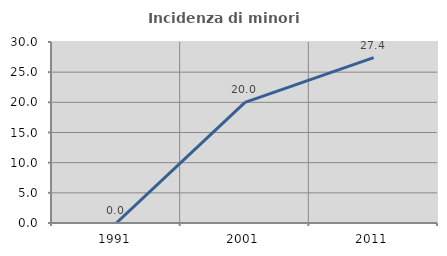
| Category | Incidenza di minori stranieri |
|---|---|
| 1991.0 | 0 |
| 2001.0 | 20 |
| 2011.0 | 27.419 |